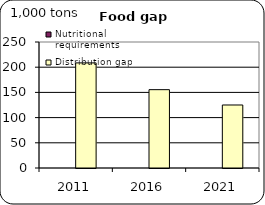
| Category | Nutritional requirements | Distribution gap |
|---|---|---|
| 2011.0 | 0 | 208.534 |
| 2016.0 | 0 | 155.441 |
| 2021.0 | 0 | 125.018 |